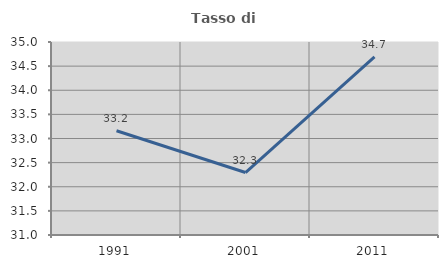
| Category | Tasso di occupazione   |
|---|---|
| 1991.0 | 33.161 |
| 2001.0 | 32.295 |
| 2011.0 | 34.694 |